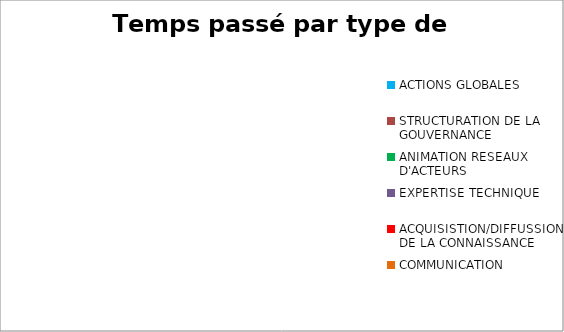
| Category | Tps passé (jours) |
|---|---|
| ACTIONS GLOBALES | 0 |
| STRUCTURATION DE LA GOUVERNANCE | 0 |
| ANIMATION RESEAUX D'ACTEURS | 0 |
| EXPERTISE TECHNIQUE | 0 |
| ACQUISISTION/DIFFUSSION DE LA CONNAISSANCE | 0 |
| COMMUNICATION | 0 |